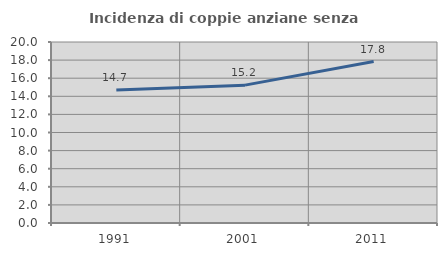
| Category | Incidenza di coppie anziane senza figli  |
|---|---|
| 1991.0 | 14.69 |
| 2001.0 | 15.234 |
| 2011.0 | 17.842 |